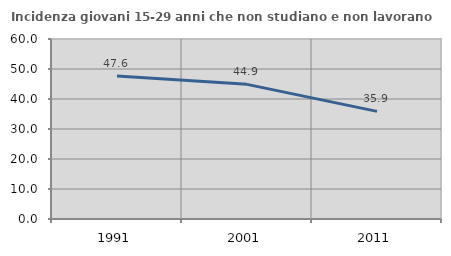
| Category | Incidenza giovani 15-29 anni che non studiano e non lavorano  |
|---|---|
| 1991.0 | 47.646 |
| 2001.0 | 44.885 |
| 2011.0 | 35.874 |